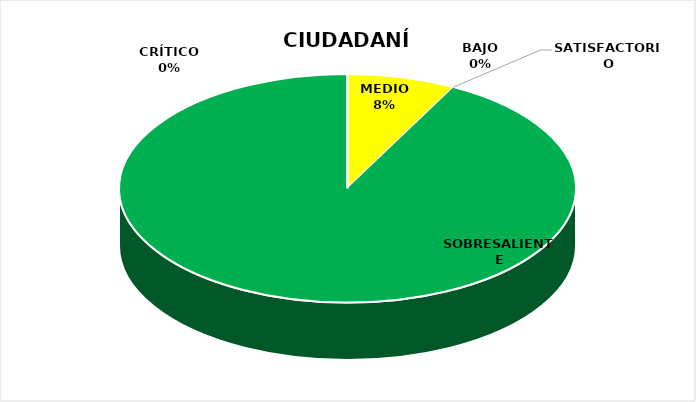
| Category | Series 0 |
|---|---|
| CRÍTICO | 0 |
| BAJO | 0 |
| MEDIO | 1 |
| SATISFACTORIO | 0 |
| SOBRESALIENTE | 12 |